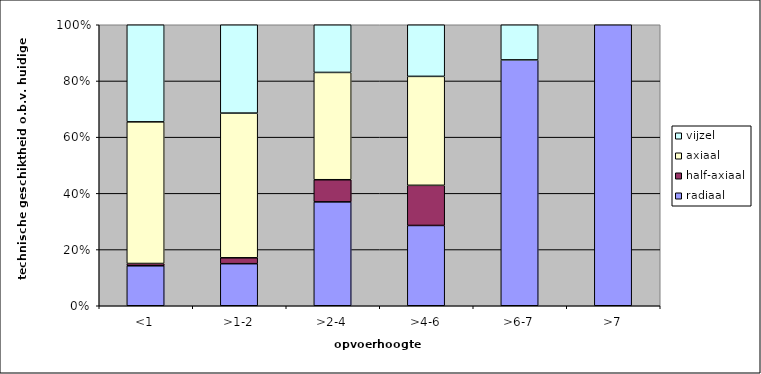
| Category | radiaal | half-axiaal | axiaal | vijzel |
|---|---|---|---|---|
| <1 | 0.142 | 0.008 | 0.504 | 0.346 |
| >1-2 | 0.15 | 0.021 | 0.515 | 0.314 |
| >2-4 | 0.37 | 0.079 | 0.382 | 0.17 |
| >4-6 | 0.286 | 0.143 | 0.388 | 0.184 |
| >6-7 | 0.875 | 0 | 0 | 0.125 |
| >7 | 1 | 0 | 0 | 0 |